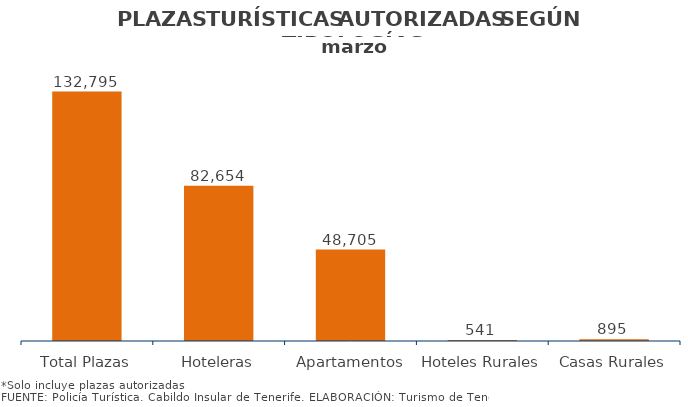
| Category | PLAZAS TURISTICAS AUTORIZADAS SEGÚN TIPOLOGÍA DEL ESTABLECIMIENTO.
Municipios e Isla marzo 2014 |
|---|---|
| Total Plazas | 132795 |
| Hoteleras | 82654 |
| Apartamentos | 48705 |
| Hoteles Rurales | 541 |
| Casas Rurales | 895 |